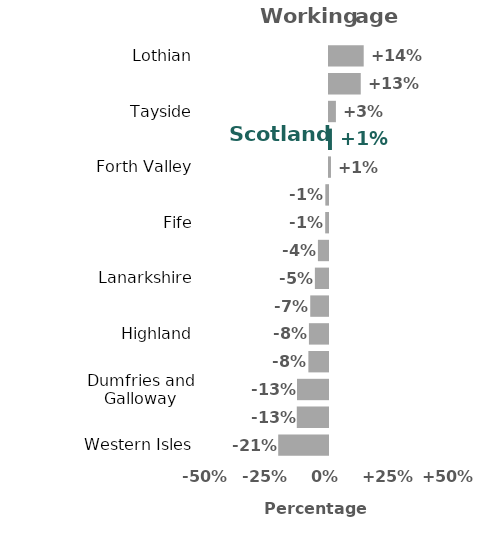
| Category | Series 0 |
|---|---|
| Western Isles | -20.744 |
| Ayrshire and Arran | -13.011 |
| Dumfries and Galloway | -12.91 |
| Shetland | -8.181 |
| Highland | -7.951 |
| Borders | -7.399 |
| Lanarkshire | -5.473 |
| Orkney | -4.207 |
| Fife | -1.171 |
| Greater Glasgow and Clyde | -1.115 |
| Forth Valley | 0.818 |
| Scotland | 1.224 |
| Tayside | 2.879 |
| Grampian | 13.239 |
| Lothian | 14.466 |